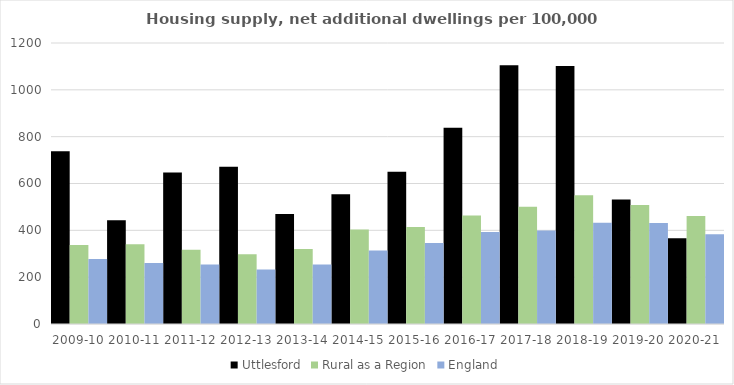
| Category | Uttlesford | Rural as a Region | England |
|---|---|---|---|
| 2009-10 | 737.972 | 337.852 | 277.548 |
| 2010-11 | 443.399 | 340.105 | 260.994 |
| 2011-12 | 647.241 | 317.04 | 254.007 |
| 2012-13 | 671.191 | 297.763 | 233.153 |
| 2013-14 | 469.279 | 319.835 | 253.602 |
| 2014-15 | 554.326 | 403.796 | 314.256 |
| 2015-16 | 650.197 | 414.091 | 346.154 |
| 2016-17 | 837.882 | 463.209 | 393.256 |
| 2017-18 | 1105.105 | 500.68 | 399.646 |
| 2018-19 | 1102.277 | 549.491 | 432.099 |
| 2019-20 | 531.309 | 508.493 | 431.187 |
| 2020-21 | 366.541 | 461.114 | 382.827 |